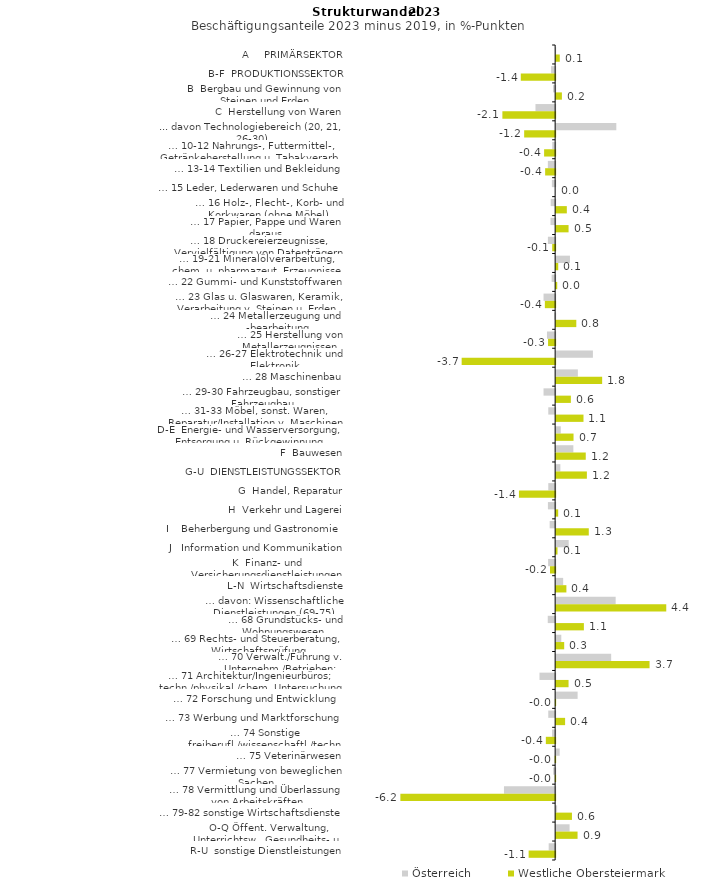
| Category | Österreich | Westliche Obersteiermark |
|---|---|---|
| A     PRIMÄRSEKTOR | -0.007 | 0.144 |
| B-F  PRODUKTIONSSEKTOR | -0.161 | -1.366 |
| B  Bergbau und Gewinnung von Steinen und Erden | -0.086 | 0.229 |
| C  Herstellung von Waren | -0.782 | -2.098 |
| ... davon Technologiebereich (20, 21, 26-30) | 2.393 | -1.232 |
| … 10-12 Nahrungs-, Futtermittel-, Getränkeherstellung u. Tabakverarb. | -0.116 | -0.439 |
| … 13-14 Textilien und Bekleidung | -0.289 | -0.398 |
| … 15 Leder, Lederwaren und Schuhe | -0.13 | 0 |
| … 16 Holz-, Flecht-, Korb- und Korkwaren (ohne Möbel)  | -0.177 | 0.425 |
| … 17 Papier, Pappe und Waren daraus  | -0.185 | 0.494 |
| … 18 Druckereierzeugnisse, Vervielfältigung von Datenträgern | -0.288 | -0.117 |
| … 19-21 Mineralölverarbeitung, chem. u. pharmazeut. Erzeugnisse | 0.549 | 0.083 |
| … 22 Gummi- und Kunststoffwaren | -0.139 | 0.043 |
| … 23 Glas u. Glaswaren, Keramik, Verarbeitung v. Steinen u. Erden  | -0.462 | -0.409 |
| … 24 Metallerzeugung und -bearbeitung | -0.032 | 0.802 |
| … 25 Herstellung von Metallerzeugnissen  | -0.325 | -0.282 |
| … 26-27 Elektrotechnik und Elektronik | 1.462 | -3.718 |
| … 28 Maschinenbau | 0.864 | 1.83 |
| … 29-30 Fahrzeugbau, sonstiger Fahrzeugbau | -0.462 | 0.586 |
| … 31-33 Möbel, sonst. Waren, Reparatur/Installation v. Maschinen | -0.273 | 1.088 |
| D-E  Energie- und Wasserversorgung, Entsorgung u. Rückgewinnung | 0.184 | 0.692 |
| F  Bauwesen | 0.684 | 1.178 |
| G-U  DIENSTLEISTUNGSSEKTOR | 0.167 | 1.222 |
| G  Handel, Reparatur | -0.273 | -1.44 |
| H  Verkehr und Lagerei | -0.287 | 0.081 |
| I    Beherbergung und Gastronomie | -0.218 | 1.298 |
| J   Information und Kommunikation | 0.499 | 0.054 |
| K  Finanz- und Versicherungsdienstleistungen | -0.279 | -0.204 |
| L-N  Wirtschaftsdienste | 0.279 | 0.408 |
| … davon: Wissenschaftliche Dienstleistungen (69-75) | 2.367 | 4.379 |
| … 68 Grundstücks- und Wohnungswesen  | -0.294 | 1.103 |
| … 69 Rechts- und Steuerberatung, Wirtschaftsprüfung | 0.205 | 0.32 |
| … 70 Verwalt./Führung v. Unternehm./Betrieben; Unternehmensberat. | 2.188 | 3.715 |
| … 71 Architektur/Ingenieurbüros; techn./physikal./chem. Untersuchung | -0.622 | 0.493 |
| … 72 Forschung und Entwicklung  | 0.854 | -0.01 |
| … 73 Werbung und Marktforschung | -0.273 | 0.356 |
| … 74 Sonstige freiberufl./wissenschaftl./techn. Tätigkeiten | -0.124 | -0.37 |
| … 75 Veterinärwesen | 0.14 | -0.017 |
| … 77 Vermietung von beweglichen Sachen  | -0.077 | -0.013 |
| … 78 Vermittlung und Überlassung von Arbeitskräften | -2.035 | -6.155 |
| … 79-82 sonstige Wirtschaftsdienste | 0.039 | 0.629 |
| O-Q Öffent. Verwaltung, Unterrichtsw., Gesundheits- u. Sozialwesen | 0.535 | 0.852 |
| R-U  sonstige Dienstleistungen | -0.256 | -1.055 |